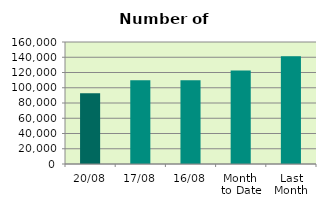
| Category | Series 0 |
|---|---|
| 20/08 | 92712 |
| 17/08 | 109880 |
| 16/08 | 109974 |
| Month 
to Date | 122651.286 |
| Last
Month | 141432.273 |